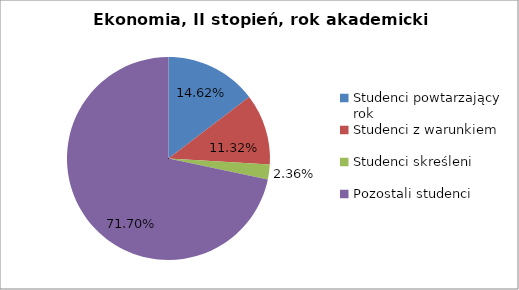
| Category | Series 0 |
|---|---|
| Studenci powtarzający rok | 31 |
| Studenci z warunkiem | 24 |
| Studenci skreśleni | 5 |
| Pozostali studenci | 152 |